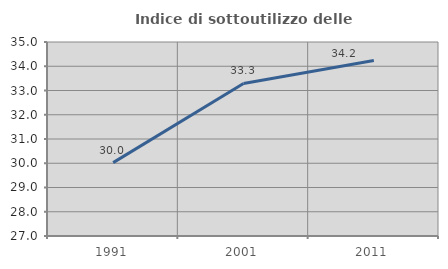
| Category | Indice di sottoutilizzo delle abitazioni  |
|---|---|
| 1991.0 | 30.025 |
| 2001.0 | 33.289 |
| 2011.0 | 34.237 |